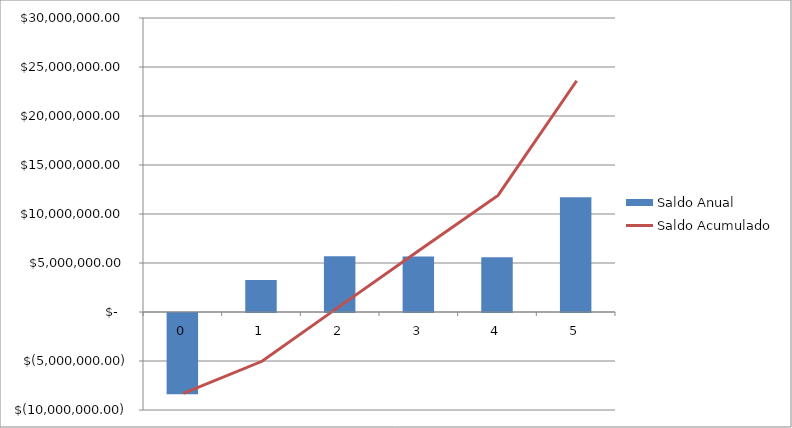
| Category | Saldo Anual |
|---|---|
| 0.0 | -8299857.386 |
| 1.0 | 3272733.124 |
| 2.0 | 5677122.04 |
| 3.0 | 5659776.436 |
| 4.0 | 5590795.694 |
| 5.0 | 11697918.16 |